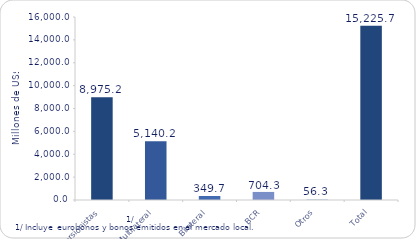
| Category | Series 1 |
|---|---|
| Inversionistas | 8975.2 |
| Multilateral | 5140.2 |
| Bilateral | 349.7 |
| BCR | 704.3 |
| Otros | 56.3 |
| Total | 15225.7 |